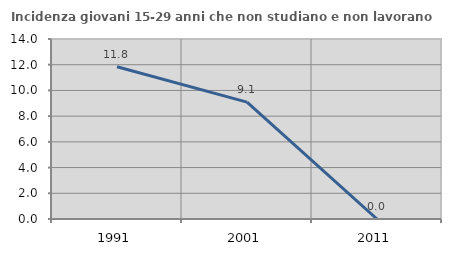
| Category | Incidenza giovani 15-29 anni che non studiano e non lavorano  |
|---|---|
| 1991.0 | 11.842 |
| 2001.0 | 9.091 |
| 2011.0 | 0 |